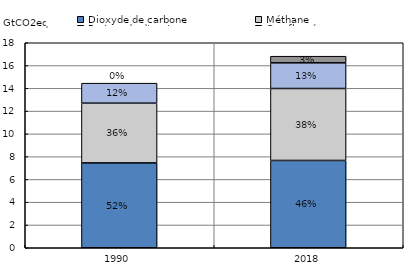
| Category | Dioxyde de carbone | Méthane | Protoxyde d'azote | Gaz fluorés |
|---|---|---|---|---|
| 1990.0 | 7.453 | 5.243 | 1.755 | 0 |
| 2018.0 | 7.666 | 6.317 | 2.256 | 0.581 |